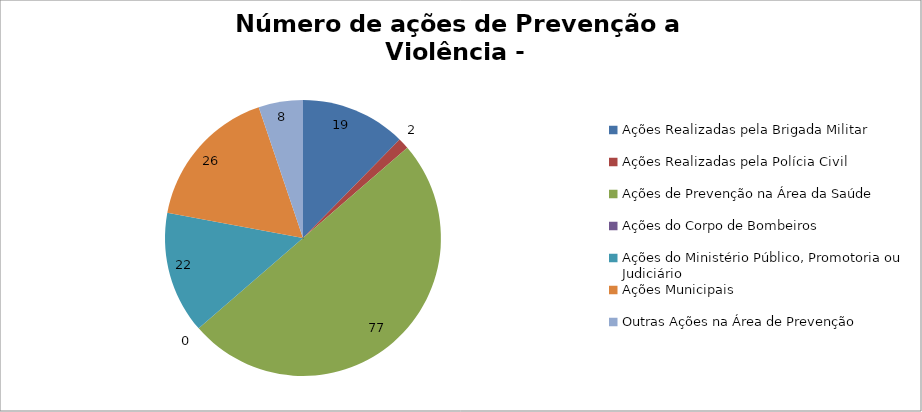
| Category | Número de Ações |
|---|---|
| Ações Realizadas pela Brigada Militar | 19 |
| Ações Realizadas pela Polícia Civil | 2 |
| Ações de Prevenção na Área da Saúde | 77 |
| Ações do Corpo de Bombeiros | 0 |
| Ações do Ministério Público, Promotoria ou Judiciário | 22 |
| Ações Municipais | 26 |
| Outras Ações na Área de Prevenção | 8 |